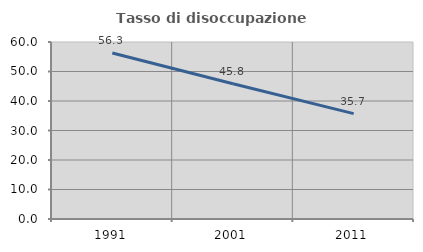
| Category | Tasso di disoccupazione giovanile  |
|---|---|
| 1991.0 | 56.25 |
| 2001.0 | 45.833 |
| 2011.0 | 35.714 |